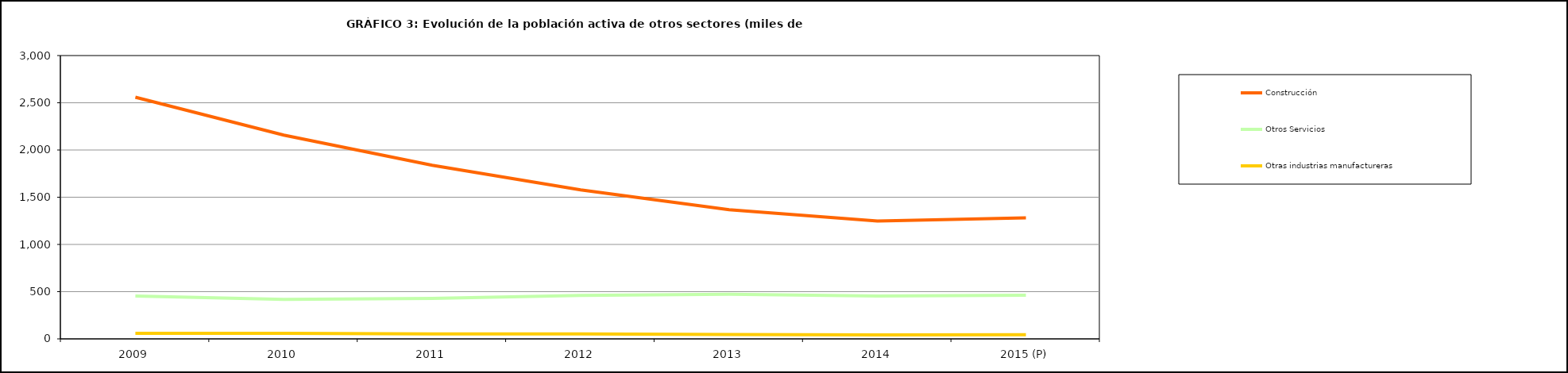
| Category | Construcción | Otros Servicios | Otras industrias manufactureras |
|---|---|---|---|
| 2009 | 2558.825 | 453.325 | 59.2 |
| 2010 | 2158.15 | 418.775 | 58.075 |
| 2011 | 1837.95 | 428.625 | 52.3 |
| 2012 | 1576.925 | 459.15 | 52.8 |
| 2013 | 1366.878 | 473.15 | 46.85 |
| 2014 | 1247.2 | 454.2 | 42.2 |
| 2015 (P) | 1280.975 | 462.325 | 44.95 |